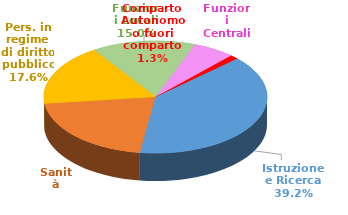
| Category | Series 0 |
|---|---|
| Istruzione e Ricerca | 1281758 |
| Sanità | 681855 |
| Pers. in regime di diritto pubblico | 576257 |
| Funzioni Locali | 491882 |
| Funzioni Centrali | 197986 |
| Comparto Autonomo o fuori comparto | 41046 |